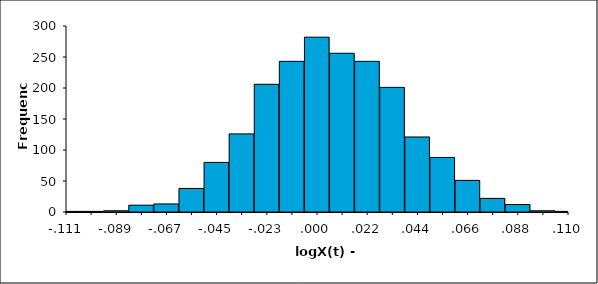
| Category | Series 0 |
|---|---|
| -0.111179718105893 | 1 |
| -0.100111746295304 | 1 |
| -0.0890437744847146 | 2 |
| -0.0779758026741253 | 11 |
| -0.066907830863536 | 13 |
| -0.0558398590529466 | 38 |
| -0.0447718872423573 | 80 |
| -0.033703915431768 | 126 |
| -0.0226359436211787 | 206 |
| -0.0115679718105893 | 243 |
| -0.000499999999999997 | 282 |
| 0.0105679718105893 | 256 |
| 0.0216359436211787 | 243 |
| 0.032703915431768 | 201 |
| 0.0437718872423573 | 121 |
| 0.0548398590529466 | 88 |
| 0.065907830863536 | 51 |
| 0.0769758026741253 | 22 |
| 0.0880437744847146 | 12 |
| 0.0991117462953039 | 2 |
| 0.110179718105893 | 1 |